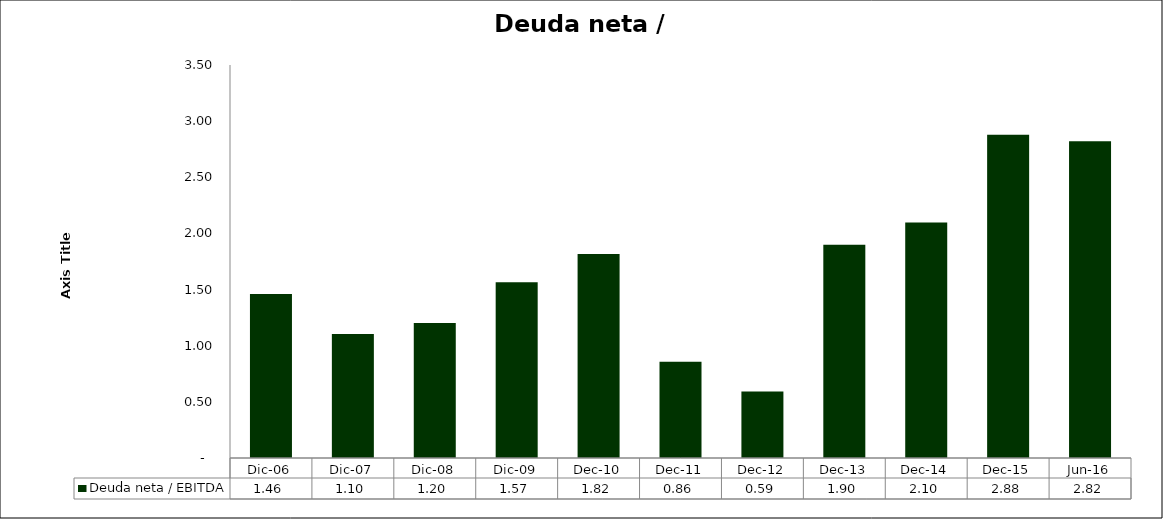
| Category | Deuda neta / EBITDA |
|---|---|
| Dic-06 | 1.461 |
| Dic-07 | 1.104 |
| Dic-08 | 1.202 |
| Dic-09 | 1.565 |
| dic-10 | 1.817 |
| dic-11 | 0.856 |
| dic-12 | 0.593 |
| dic-13 | 1.899 |
| dic-14 | 2.097 |
| dic-15 | 2.879 |
| jun-16 | 2.822 |